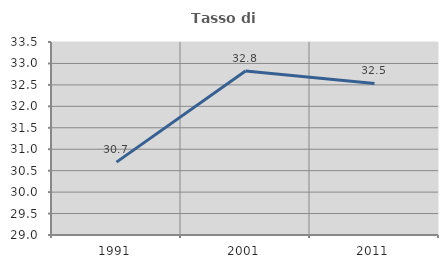
| Category | Tasso di occupazione   |
|---|---|
| 1991.0 | 30.699 |
| 2001.0 | 32.823 |
| 2011.0 | 32.534 |